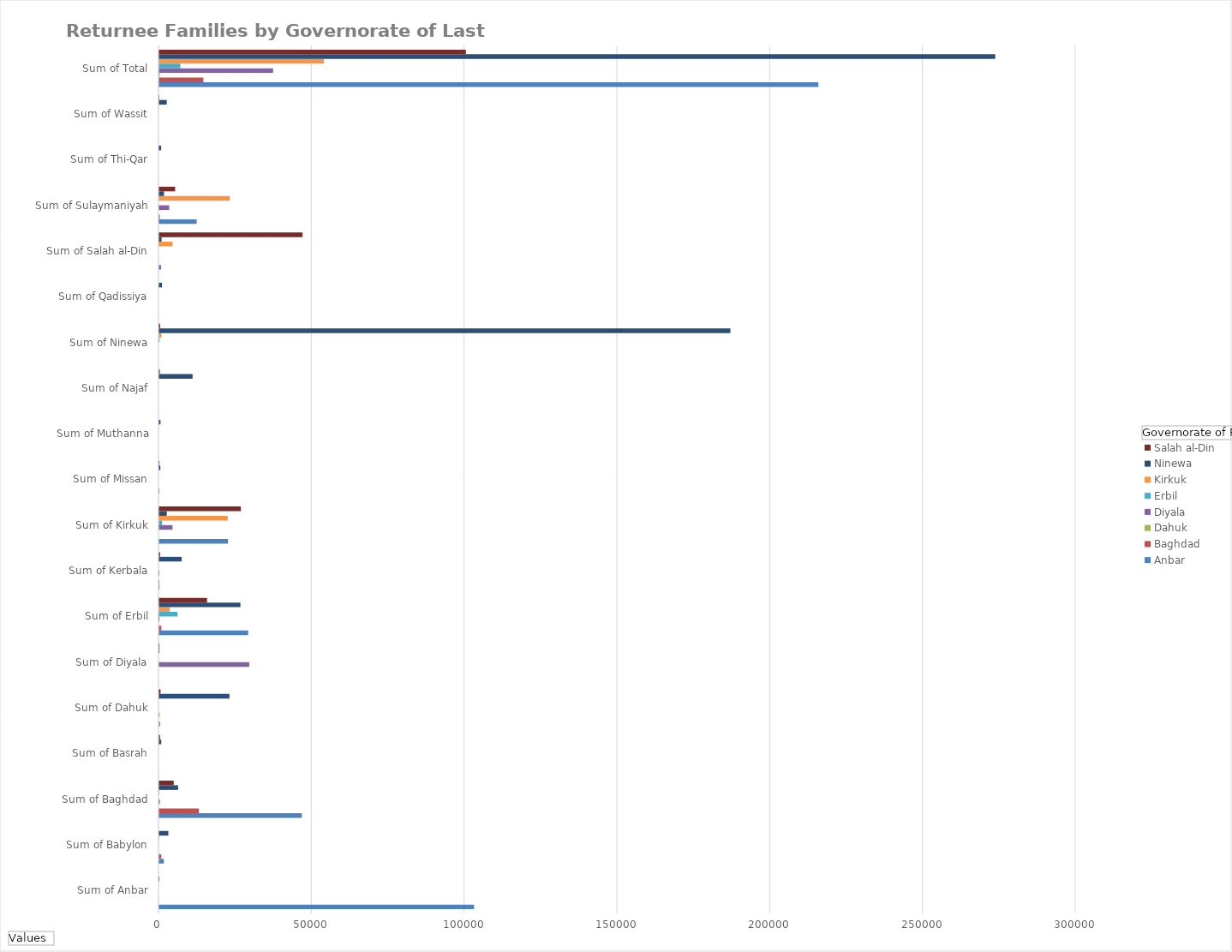
| Category | Anbar | Baghdad | Dahuk | Diyala | Erbil | Kirkuk | Ninewa | Salah al-Din |
|---|---|---|---|---|---|---|---|---|
| Sum of Anbar | 102983 | 0 | 0 | 0 | 0 | 0 | 30 | 0 |
| Sum of Babylon | 1477 | 633 | 0 | 0 | 0 | 3 | 2950 | 0 |
| Sum of Baghdad | 46623 | 12949 | 0 | 167 | 0 | 39 | 6130 | 4694 |
| Sum of Basrah | 0 | 0 | 0 | 0 | 0 | 0 | 628 | 218 |
| Sum of Dahuk | 184 | 0 | 130 | 0 | 0 | 0 | 22930 | 389 |
| Sum of Diyala | 0 | 0 | 0 | 29425 | 0 | 0 | 48 | 32 |
| Sum of Erbil | 29062 | 665 | 0 | 73 | 5900 | 3411 | 26526 | 15601 |
| Sum of Kerbala | 60 | 8 | 0 | 25 | 0 | 0 | 7314 | 247 |
| Sum of Kirkuk | 22488 | 0 | 0 | 4308 | 879 | 22379 | 2438 | 26673 |
| Sum of Missan | 0 | 20 | 0 | 0 | 0 | 0 | 327 | 30 |
| Sum of Muthanna | 0 | 0 | 0 | 0 | 0 | 0 | 380 | 0 |
| Sum of Najaf | 0 | 0 | 0 | 0 | 0 | 0 | 10875 | 160 |
| Sum of Ninewa | 0 | 0 | 0 | 0 | 81 | 672 | 186864 | 241 |
| Sum of Qadissiya | 0 | 0 | 0 | 0 | 0 | 0 | 839 | 0 |
| Sum of Salah al-Din | 573 | 0 | 0 | 0 | 0 | 4305 | 731 | 46862 |
| Sum of Sulaymaniyah | 12226 | 127 | 0 | 3223 | 0 | 23038 | 1526 | 5162 |
| Sum of Thi-Qar | 0 | 0 | 0 | 0 | 0 | 0 | 587 | 0 |
| Sum of Wassit | 0 | 0 | 0 | 0 | 0 | 0 | 2427 | 2 |
| Sum of Total | 215676 | 14402 | 130 | 37221 | 6860 | 53847 | 273550 | 100311 |